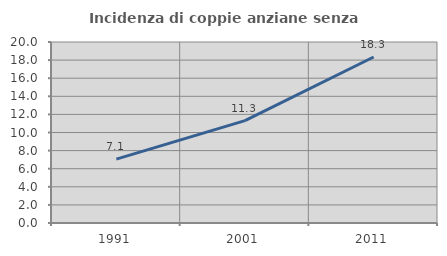
| Category | Incidenza di coppie anziane senza figli  |
|---|---|
| 1991.0 | 7.063 |
| 2001.0 | 11.313 |
| 2011.0 | 18.343 |